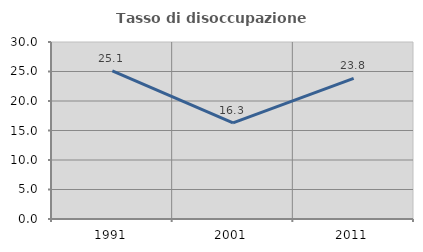
| Category | Tasso di disoccupazione giovanile  |
|---|---|
| 1991.0 | 25.088 |
| 2001.0 | 16.281 |
| 2011.0 | 23.825 |